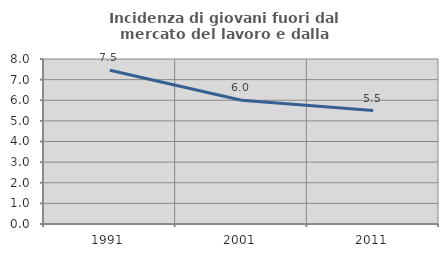
| Category | Incidenza di giovani fuori dal mercato del lavoro e dalla formazione  |
|---|---|
| 1991.0 | 7.456 |
| 2001.0 | 6 |
| 2011.0 | 5.497 |